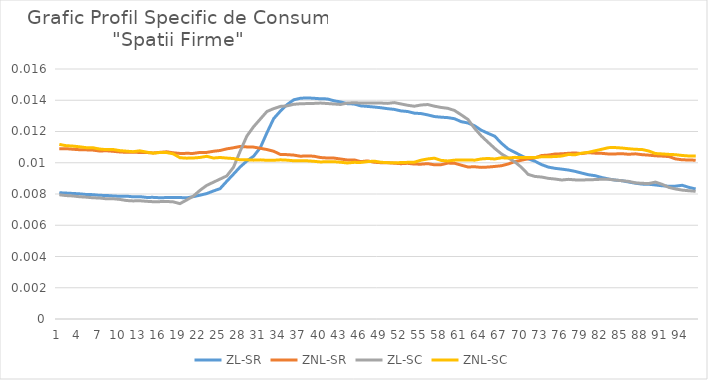
| Category | ZL-SR | ZNL-SR | ZL-SC | ZNL-SC |
|---|---|---|---|---|
| 0 | 0.008 | 0.011 | 0.008 | 0.011 |
| 1 | 0.008 | 0.011 | 0.008 | 0.011 |
| 2 | 0.008 | 0.011 | 0.008 | 0.011 |
| 3 | 0.008 | 0.011 | 0.008 | 0.011 |
| 4 | 0.008 | 0.011 | 0.008 | 0.011 |
| 5 | 0.008 | 0.011 | 0.008 | 0.011 |
| 6 | 0.008 | 0.011 | 0.008 | 0.011 |
| 7 | 0.008 | 0.011 | 0.008 | 0.011 |
| 8 | 0.008 | 0.011 | 0.008 | 0.011 |
| 9 | 0.008 | 0.011 | 0.008 | 0.011 |
| 10 | 0.008 | 0.011 | 0.008 | 0.011 |
| 11 | 0.008 | 0.011 | 0.008 | 0.011 |
| 12 | 0.008 | 0.011 | 0.008 | 0.011 |
| 13 | 0.008 | 0.011 | 0.008 | 0.011 |
| 14 | 0.008 | 0.011 | 0.008 | 0.011 |
| 15 | 0.008 | 0.011 | 0.008 | 0.011 |
| 16 | 0.008 | 0.011 | 0.008 | 0.011 |
| 17 | 0.008 | 0.011 | 0.007 | 0.011 |
| 18 | 0.008 | 0.011 | 0.007 | 0.01 |
| 19 | 0.008 | 0.011 | 0.008 | 0.01 |
| 20 | 0.008 | 0.011 | 0.008 | 0.01 |
| 21 | 0.008 | 0.011 | 0.008 | 0.01 |
| 22 | 0.008 | 0.011 | 0.009 | 0.01 |
| 23 | 0.008 | 0.011 | 0.009 | 0.01 |
| 24 | 0.008 | 0.011 | 0.009 | 0.01 |
| 25 | 0.009 | 0.011 | 0.009 | 0.01 |
| 26 | 0.009 | 0.011 | 0.01 | 0.01 |
| 27 | 0.01 | 0.011 | 0.011 | 0.01 |
| 28 | 0.01 | 0.011 | 0.012 | 0.01 |
| 29 | 0.01 | 0.011 | 0.012 | 0.01 |
| 30 | 0.011 | 0.011 | 0.013 | 0.01 |
| 31 | 0.012 | 0.011 | 0.013 | 0.01 |
| 32 | 0.013 | 0.011 | 0.013 | 0.01 |
| 33 | 0.013 | 0.011 | 0.014 | 0.01 |
| 34 | 0.014 | 0.011 | 0.014 | 0.01 |
| 35 | 0.014 | 0.01 | 0.014 | 0.01 |
| 36 | 0.014 | 0.01 | 0.014 | 0.01 |
| 37 | 0.014 | 0.01 | 0.014 | 0.01 |
| 38 | 0.014 | 0.01 | 0.014 | 0.01 |
| 39 | 0.014 | 0.01 | 0.014 | 0.01 |
| 40 | 0.014 | 0.01 | 0.014 | 0.01 |
| 41 | 0.014 | 0.01 | 0.014 | 0.01 |
| 42 | 0.014 | 0.01 | 0.014 | 0.01 |
| 43 | 0.014 | 0.01 | 0.014 | 0.01 |
| 44 | 0.014 | 0.01 | 0.014 | 0.01 |
| 45 | 0.014 | 0.01 | 0.014 | 0.01 |
| 46 | 0.014 | 0.01 | 0.014 | 0.01 |
| 47 | 0.014 | 0.01 | 0.014 | 0.01 |
| 48 | 0.014 | 0.01 | 0.014 | 0.01 |
| 49 | 0.013 | 0.01 | 0.014 | 0.01 |
| 50 | 0.013 | 0.01 | 0.014 | 0.01 |
| 51 | 0.013 | 0.01 | 0.014 | 0.01 |
| 52 | 0.013 | 0.01 | 0.014 | 0.01 |
| 53 | 0.013 | 0.01 | 0.014 | 0.01 |
| 54 | 0.013 | 0.01 | 0.014 | 0.01 |
| 55 | 0.013 | 0.01 | 0.014 | 0.01 |
| 56 | 0.013 | 0.01 | 0.014 | 0.01 |
| 57 | 0.013 | 0.01 | 0.014 | 0.01 |
| 58 | 0.013 | 0.01 | 0.013 | 0.01 |
| 59 | 0.013 | 0.01 | 0.013 | 0.01 |
| 60 | 0.013 | 0.01 | 0.013 | 0.01 |
| 61 | 0.013 | 0.01 | 0.013 | 0.01 |
| 62 | 0.012 | 0.01 | 0.012 | 0.01 |
| 63 | 0.012 | 0.01 | 0.012 | 0.01 |
| 64 | 0.012 | 0.01 | 0.011 | 0.01 |
| 65 | 0.012 | 0.01 | 0.011 | 0.01 |
| 66 | 0.011 | 0.01 | 0.011 | 0.01 |
| 67 | 0.011 | 0.01 | 0.01 | 0.01 |
| 68 | 0.011 | 0.01 | 0.01 | 0.01 |
| 69 | 0.01 | 0.01 | 0.01 | 0.01 |
| 70 | 0.01 | 0.01 | 0.009 | 0.01 |
| 71 | 0.01 | 0.01 | 0.009 | 0.01 |
| 72 | 0.01 | 0.01 | 0.009 | 0.01 |
| 73 | 0.01 | 0.01 | 0.009 | 0.01 |
| 74 | 0.01 | 0.011 | 0.009 | 0.01 |
| 75 | 0.01 | 0.011 | 0.009 | 0.01 |
| 76 | 0.01 | 0.011 | 0.009 | 0.011 |
| 77 | 0.009 | 0.011 | 0.009 | 0.011 |
| 78 | 0.009 | 0.011 | 0.009 | 0.011 |
| 79 | 0.009 | 0.011 | 0.009 | 0.011 |
| 80 | 0.009 | 0.011 | 0.009 | 0.011 |
| 81 | 0.009 | 0.011 | 0.009 | 0.011 |
| 82 | 0.009 | 0.011 | 0.009 | 0.011 |
| 83 | 0.009 | 0.011 | 0.009 | 0.011 |
| 84 | 0.009 | 0.011 | 0.009 | 0.011 |
| 85 | 0.009 | 0.011 | 0.009 | 0.011 |
| 86 | 0.009 | 0.011 | 0.009 | 0.011 |
| 87 | 0.009 | 0.011 | 0.009 | 0.011 |
| 88 | 0.009 | 0.01 | 0.009 | 0.011 |
| 89 | 0.009 | 0.01 | 0.009 | 0.011 |
| 90 | 0.009 | 0.01 | 0.009 | 0.011 |
| 91 | 0.008 | 0.01 | 0.008 | 0.011 |
| 92 | 0.009 | 0.01 | 0.008 | 0.011 |
| 93 | 0.009 | 0.01 | 0.008 | 0.01 |
| 94 | 0.008 | 0.01 | 0.008 | 0.01 |
| 95 | 0.008 | 0.01 | 0.008 | 0.01 |